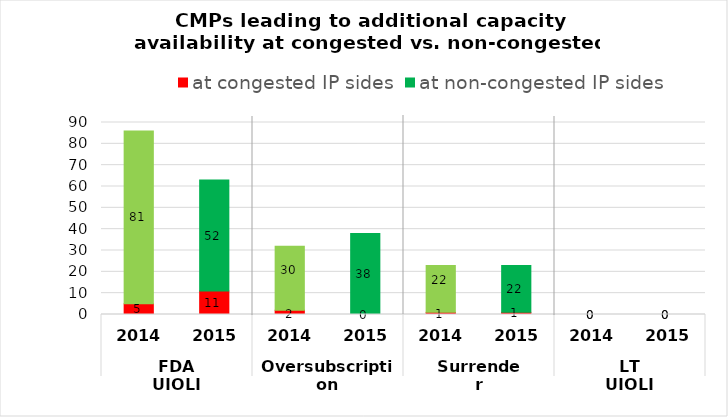
| Category | at congested IP sides | at non-congested IP sides |
|---|---|---|
| 0 | 5 | 81 |
| 1 | 11 | 52 |
| 2 | 2 | 30 |
| 3 | 0 | 38 |
| 4 | 1 | 22 |
| 5 | 1 | 22 |
| 6 | 0 | 0 |
| 7 | 0 | 0 |